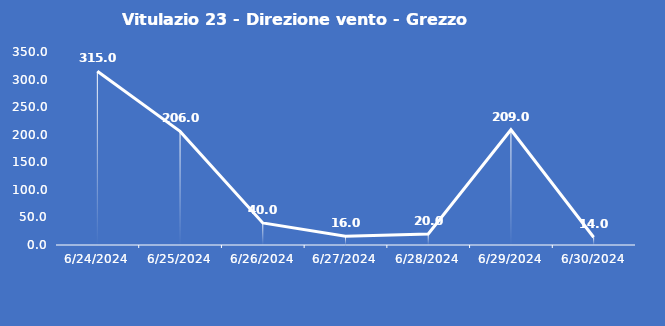
| Category | Vitulazio 23 - Direzione vento - Grezzo (°N) |
|---|---|
| 6/24/24 | 315 |
| 6/25/24 | 206 |
| 6/26/24 | 40 |
| 6/27/24 | 16 |
| 6/28/24 | 20 |
| 6/29/24 | 209 |
| 6/30/24 | 14 |